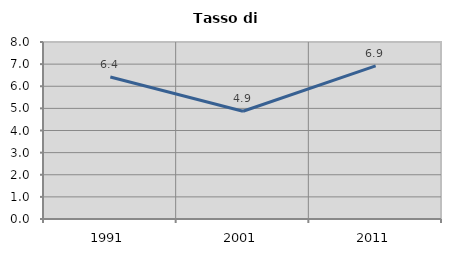
| Category | Tasso di disoccupazione   |
|---|---|
| 1991.0 | 6.415 |
| 2001.0 | 4.868 |
| 2011.0 | 6.923 |